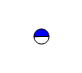
| Category | Series 0 |
|---|---|
| 0 | 2054916 |
| 1 | 2079435 |